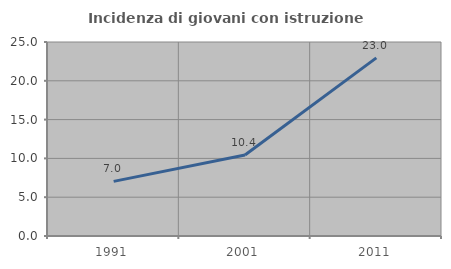
| Category | Incidenza di giovani con istruzione universitaria |
|---|---|
| 1991.0 | 7.042 |
| 2001.0 | 10.448 |
| 2011.0 | 22.951 |